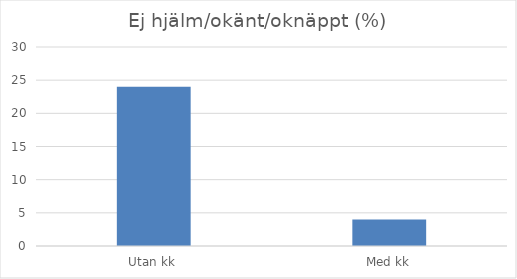
| Category | Series 0 |
|---|---|
| Utan kk | 24 |
| Med kk | 4 |